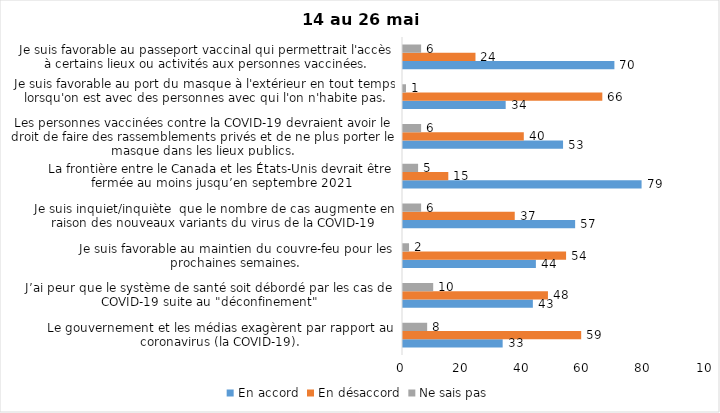
| Category | En accord | En désaccord | Ne sais pas |
|---|---|---|---|
| Le gouvernement et les médias exagèrent par rapport au coronavirus (la COVID-19). | 33 | 59 | 8 |
| J’ai peur que le système de santé soit débordé par les cas de COVID-19 suite au "déconfinement" | 43 | 48 | 10 |
| Je suis favorable au maintien du couvre-feu pour les prochaines semaines. | 44 | 54 | 2 |
| Je suis inquiet/inquiète  que le nombre de cas augmente en raison des nouveaux variants du virus de la COVID-19 | 57 | 37 | 6 |
| La frontière entre le Canada et les États-Unis devrait être fermée au moins jusqu’en septembre 2021 | 79 | 15 | 5 |
| Les personnes vaccinées contre la COVID-19 devraient avoir le droit de faire des rassemblements privés et de ne plus porter le masque dans les lieux publics. | 53 | 40 | 6 |
| Je suis favorable au port du masque à l'extérieur en tout temps lorsqu'on est avec des personnes avec qui l'on n'habite pas. | 34 | 66 | 1 |
| Je suis favorable au passeport vaccinal qui permettrait l'accès à certains lieux ou activités aux personnes vaccinées. | 70 | 24 | 6 |